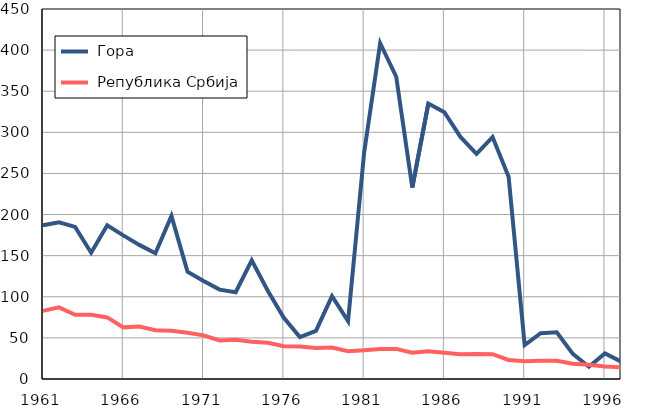
| Category |  Гора |  Република Србија |
|---|---|---|
| 1961.0 | 186.9 | 82.9 |
| 1962.0 | 190.6 | 87.1 |
| 1963.0 | 185 | 78.2 |
| 1964.0 | 153.6 | 78.2 |
| 1965.0 | 187 | 74.9 |
| 1966.0 | 174.7 | 62.8 |
| 1967.0 | 163.1 | 63.8 |
| 1968.0 | 152.9 | 59.4 |
| 1969.0 | 198.3 | 58.7 |
| 1970.0 | 130.6 | 56.3 |
| 1971.0 | 119.3 | 53.1 |
| 1972.0 | 108.7 | 46.9 |
| 1973.0 | 105.6 | 47.7 |
| 1974.0 | 144.2 | 45.3 |
| 1975.0 | 107.3 | 44 |
| 1976.0 | 74.5 | 39.9 |
| 1977.0 | 51 | 39.6 |
| 1978.0 | 58.5 | 37.8 |
| 1979.0 | 100.7 | 38.2 |
| 1980.0 | 70.4 | 33.9 |
| 1981.0 | 275.2 | 35 |
| 1982.0 | 408.4 | 36.5 |
| 1983.0 | 367.6 | 36.6 |
| 1984.0 | 232.8 | 31.9 |
| 1985.0 | 335 | 33.7 |
| 1986.0 | 324.5 | 32 |
| 1987.0 | 294.4 | 30.2 |
| 1988.0 | 273.8 | 30.5 |
| 1989.0 | 294.3 | 30.2 |
| 1990.0 | 246.1 | 23.2 |
| 1991.0 | 41.3 | 21.6 |
| 1992.0 | 55.7 | 22.3 |
| 1993.0 | 56.9 | 22.3 |
| 1994.0 | 30.5 | 18.6 |
| 1995.0 | 14.9 | 17.2 |
| 1996.0 | 31.2 | 15.1 |
| 1997.0 | 21.3 | 14.2 |